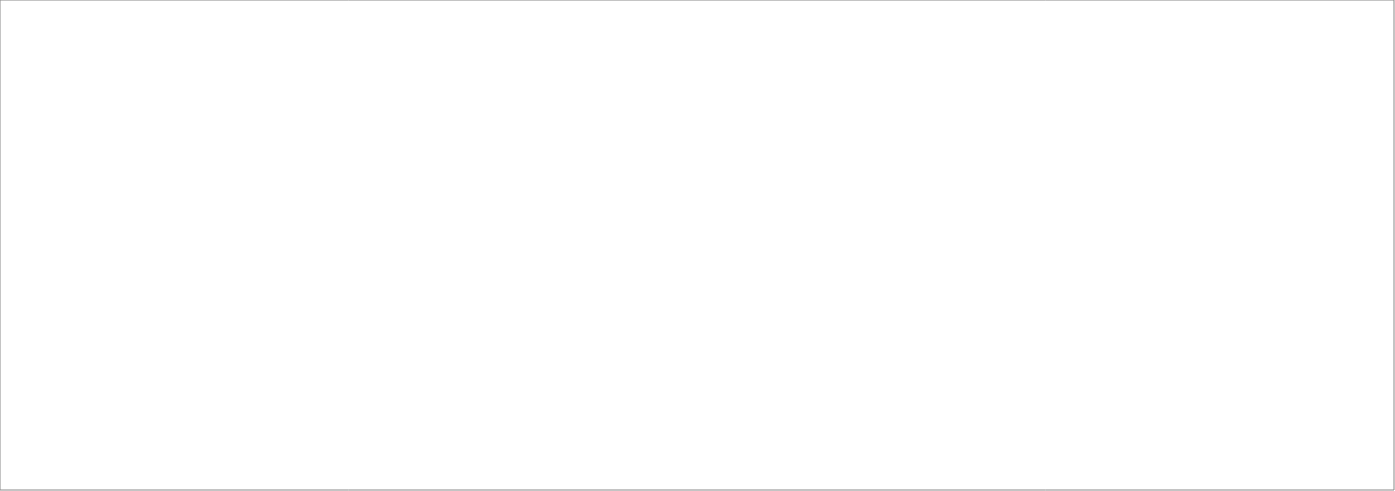
| Category | Producto Interno Bruto (PIB) |
|---|---|
| 2018_I | 138357.435 |
| 2018_II | 140382.053 |
| 2018_III | 147103.453 |
| 2018_IV | 164116.819 |
| 2019_I | 147504.285 |
| 2019_II | 150532.388 |
| 2019_III | 0 |
| 2019_IV | 0 |